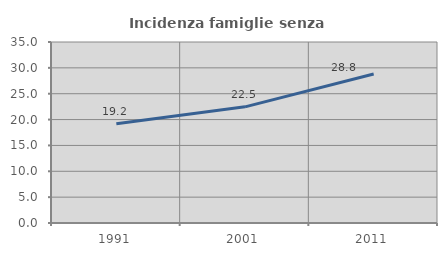
| Category | Incidenza famiglie senza nuclei |
|---|---|
| 1991.0 | 19.208 |
| 2001.0 | 22.458 |
| 2011.0 | 28.803 |